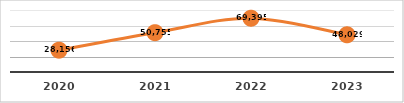
| Category | PERSONAS CAPACITADAS
PRIMER SEMESTRE, EJERCICIO 2023 |
|---|---|
| 2020.0 | 28156 |
| 2021.0 | 50755 |
| 2022.0 | 69395 |
| 2023.0 | 48029 |